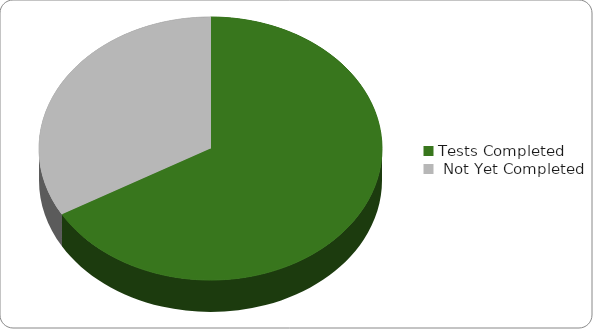
| Category | Series 0 |
|---|---|
| Tests Completed  | 6 |
|  Not Yet Completed | 3 |